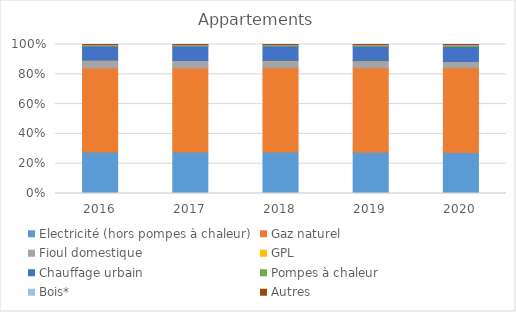
| Category | Electricité (hors pompes à chaleur) | Gaz naturel | Fioul domestique | GPL | Chauffage urbain | Pompes à chaleur | Bois* | Autres |
|---|---|---|---|---|---|---|---|---|
| 2016.0 | 0.279 | 0.564 | 0.05 | 0.001 | 0.096 | 0.004 | 0.004 | 0.002 |
| 2017.0 | 0.278 | 0.565 | 0.049 | 0.001 | 0.097 | 0.005 | 0.004 | 0.001 |
| 2018.0 | 0.278 | 0.566 | 0.048 | 0.001 | 0.097 | 0.005 | 0.004 | 0.001 |
| 2019.0 | 0.277 | 0.567 | 0.046 | 0.001 | 0.098 | 0.006 | 0.004 | 0.001 |
| 2020.0 | 0.275 | 0.569 | 0.042 | 0.001 | 0.101 | 0.008 | 0.004 | 0.001 |